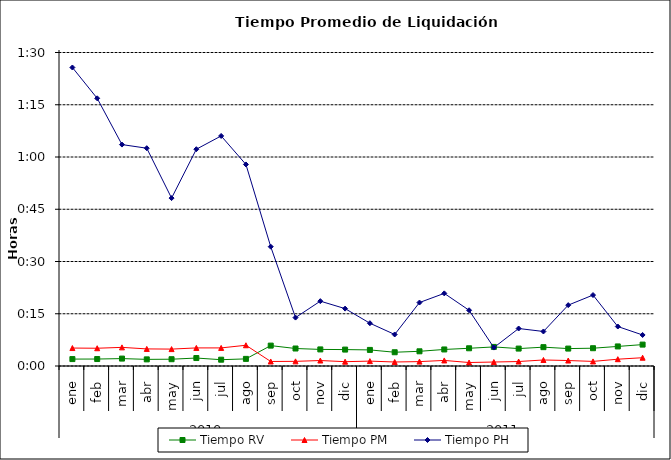
| Category | Tiempo RV | Tiempo PM | Tiempo PH |
|---|---|---|---|
| 0 | 0.001 | 0.004 | 0.06 |
| 1 | 0.001 | 0.004 | 0.053 |
| 2 | 0.001 | 0.004 | 0.044 |
| 3 | 0.001 | 0.003 | 0.043 |
| 4 | 0.001 | 0.003 | 0.033 |
| 5 | 0.002 | 0.004 | 0.043 |
| 6 | 0.001 | 0.004 | 0.046 |
| 7 | 0.001 | 0.004 | 0.04 |
| 8 | 0.004 | 0.001 | 0.024 |
| 9 | 0.003 | 0.001 | 0.01 |
| 10 | 0.003 | 0.001 | 0.013 |
| 11 | 0.003 | 0.001 | 0.011 |
| 12 | 0.003 | 0.001 | 0.009 |
| 13 | 0.003 | 0.001 | 0.006 |
| 14 | 0.003 | 0.001 | 0.013 |
| 15 | 0.003 | 0.001 | 0.014 |
| 16 | 0.004 | 0.001 | 0.011 |
| 17 | 0.004 | 0.001 | 0.004 |
| 18 | 0.003 | 0.001 | 0.007 |
| 19 | 0.004 | 0.001 | 0.007 |
| 20 | 0.003 | 0.001 | 0.012 |
| 21 | 0.004 | 0.001 | 0.014 |
| 22 | 0.004 | 0.001 | 0.008 |
| 23 | 0.004 | 0.002 | 0.006 |